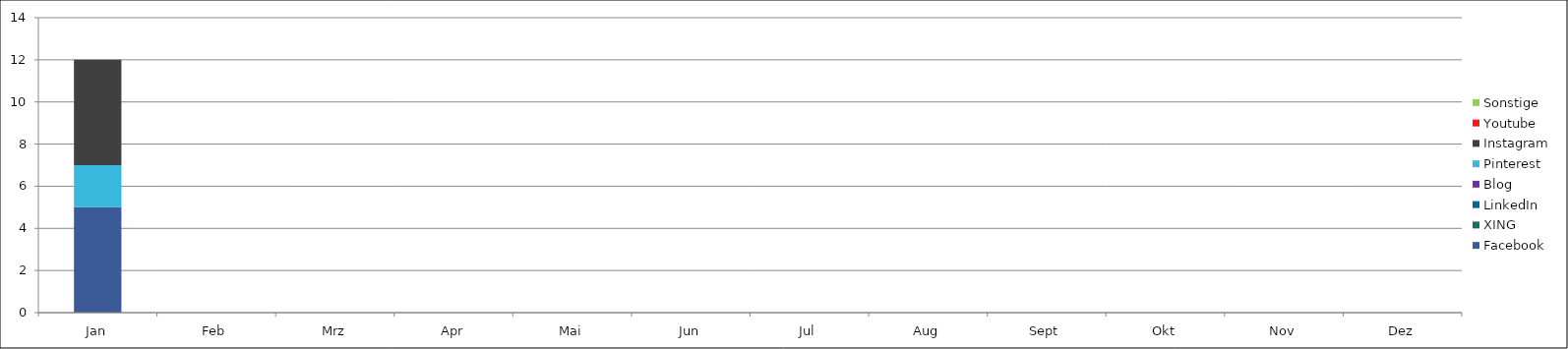
| Category | Facebook | XING | LinkedIn | Blog | Pinterest | Instagram | Youtube | Sonstige |
|---|---|---|---|---|---|---|---|---|
| Jan | 5 | 0 | 0 | 0 | 2 | 5 | 0 | 0 |
| Feb | 0 | 0 | 0 | 0 | 0 | 0 | 0 | 0 |
| Mrz | 0 | 0 | 0 | 0 | 0 | 0 | 0 | 0 |
| Apr | 0 | 0 | 0 | 0 | 0 | 0 | 0 | 0 |
| Mai | 0 | 0 | 0 | 0 | 0 | 0 | 0 | 0 |
| Jun | 0 | 0 | 0 | 0 | 0 | 0 | 0 | 0 |
| Jul | 0 | 0 | 0 | 0 | 0 | 0 | 0 | 0 |
| Aug | 0 | 0 | 0 | 0 | 0 | 0 | 0 | 0 |
| Sept | 0 | 0 | 0 | 0 | 0 | 0 | 0 | 0 |
| Okt | 0 | 0 | 0 | 0 | 0 | 0 | 0 | 0 |
| Nov | 0 | 0 | 0 | 0 | 0 | 0 | 0 | 0 |
| Dez | 0 | 0 | 0 | 0 | 0 | 0 | 0 | 0 |